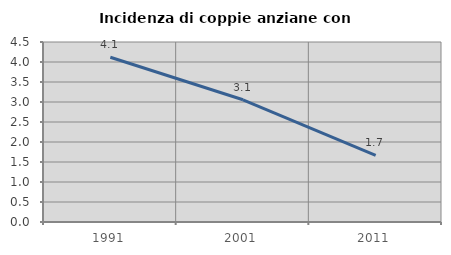
| Category | Incidenza di coppie anziane con figli |
|---|---|
| 1991.0 | 4.118 |
| 2001.0 | 3.056 |
| 2011.0 | 1.663 |